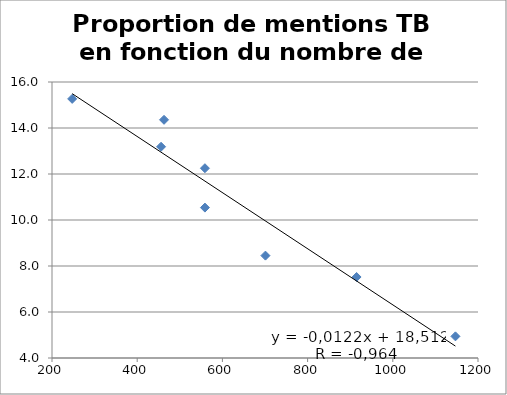
| Category | Proportion de mentions TB en fonction du nombre de Jordan |
|---|---|
| 1147.0 | 4.941 |
| 915.0 | 7.521 |
| 701.0 | 8.451 |
| 559.0 | 10.539 |
| 559.0 | 12.251 |
| 456.0 | 13.185 |
| 463.0 | 14.356 |
| 247.3399999999965 | 15.266 |